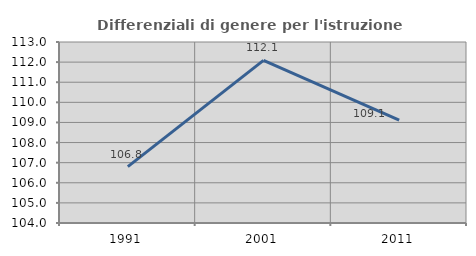
| Category | Differenziali di genere per l'istruzione superiore |
|---|---|
| 1991.0 | 106.806 |
| 2001.0 | 112.088 |
| 2011.0 | 109.117 |